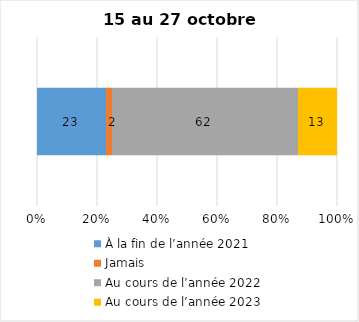
| Category | À la fin de l’année 2021 | Jamais | Au cours de l’année 2022 | Au cours de l’année 2023 |
|---|---|---|---|---|
| 0 | 23 | 2 | 62 | 13 |